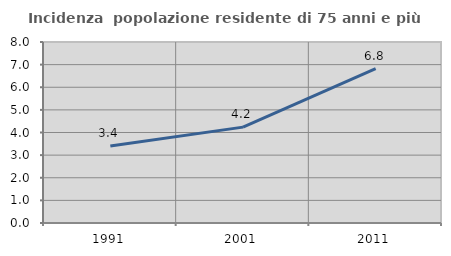
| Category | Incidenza  popolazione residente di 75 anni e più |
|---|---|
| 1991.0 | 3.402 |
| 2001.0 | 4.238 |
| 2011.0 | 6.819 |